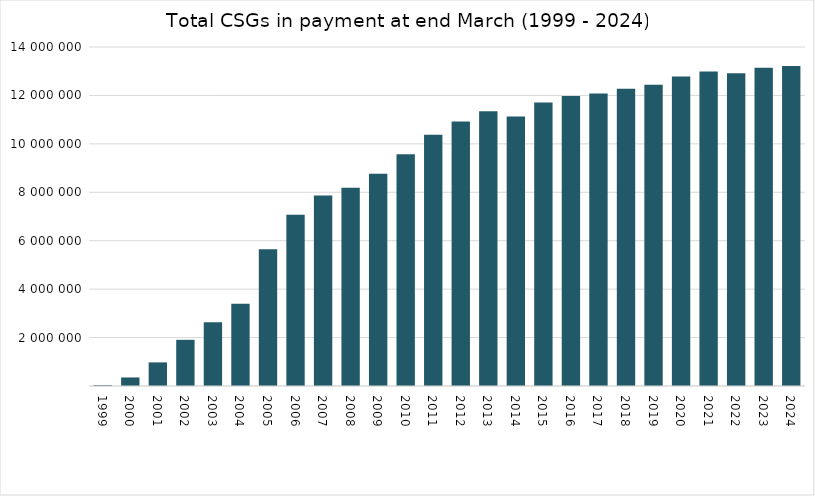
| Category | Series 0 |
|---|---|
| 1999 | 34471 |
| 2000 | 352617 |
| 2001 | 974724 |
| 2002 | 1907774 |
| 2003 | 2630826 |
| 2004 | 3398619 |
| 2005 | 5648800 |
| 2006 | 7075266 |
| 2007 | 7863841 |
| 2008 | 8189975 |
| 2009 | 8765354 |
| 2010 | 9570287 |
| 2011 | 10371950 |
| 2012 | 10927731 |
| 2013 | 11341988 |
| 2014 | 11125946 |
| 2015 | 11703165 |
| 2016 | 11972900 |
| 2017 | 12081375 |
| 2018 | 12273900 |
| 2019 | 12445310 |
| 2020 | 12784324 |
| 2021 | 12992678 |
| 2022 | 12915740 |
| 2023 | 13147954 |
| 2024 | 13218724 |